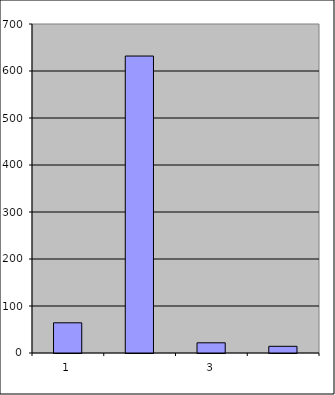
| Category | Series 0 |
|---|---|
| 0 | 64.25 |
| 1 | 631.844 |
| 2 | 21.692 |
| 3 | 14.202 |